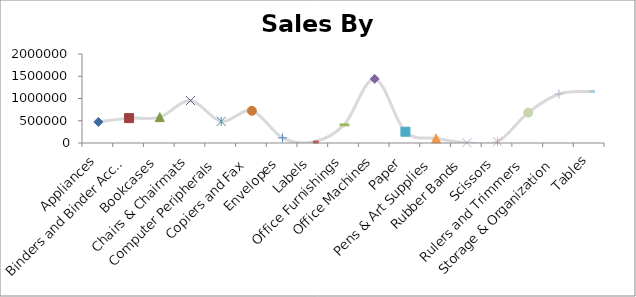
| Category | Total |
|---|---|
| Appliances | 474028.81 |
| Binders and Binder Accessories | 559070.03 |
| Bookcases | 581857.77 |
| Chairs & Chairmats | 953531.68 |
| Computer Peripherals | 486024.67 |
| Copiers and Fax | 723695.29 |
| Envelopes | 114881.07 |
| Labels | 20456.42 |
| Office Furnishings | 406931.68 |
| Office Machines | 1439922.78 |
| Paper | 253178.26 |
| Pens & Art Supplies | 102956.49 |
| Rubber Bands | 7494.45 |
| Scissors, Rulers and Trimmers | 28656.3 |
| Storage & Organization | 682351.62 |
| Tables | 1101743.656 |
| Telephones and Communication | 1157740.162 |